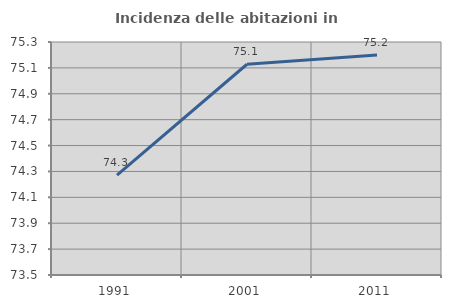
| Category | Incidenza delle abitazioni in proprietà  |
|---|---|
| 1991.0 | 74.272 |
| 2001.0 | 75.128 |
| 2011.0 | 75.2 |